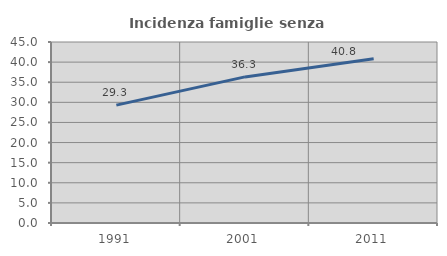
| Category | Incidenza famiglie senza nuclei |
|---|---|
| 1991.0 | 29.306 |
| 2001.0 | 36.322 |
| 2011.0 | 40.833 |